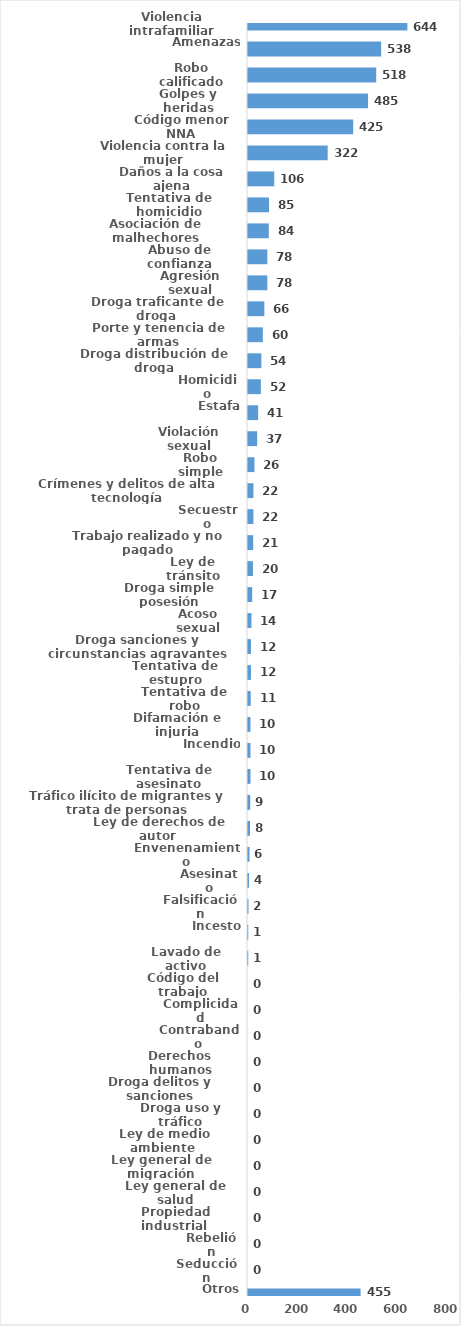
| Category | Series 0 |
|---|---|
| Violencia intrafamiliar | 644 |
| Amenazas | 538 |
| Robo calificado | 518 |
| Golpes y heridas | 485 |
| Código menor NNA | 425 |
| Violencia contra la mujer | 322 |
| Daños a la cosa ajena | 106 |
| Tentativa de homicidio | 85 |
| Asociación de malhechores | 84 |
| Abuso de confianza | 78 |
| Agresión sexual | 78 |
| Droga traficante de droga  | 66 |
| Porte y tenencia de armas | 60 |
| Droga distribución de droga | 54 |
| Homicidio | 52 |
| Estafa | 41 |
| Violación sexual | 37 |
| Robo simple | 26 |
| Crímenes y delitos de alta tecnología | 22 |
| Secuestro | 22 |
| Trabajo realizado y no pagado | 21 |
| Ley de tránsito | 20 |
| Droga simple posesión | 17 |
| Acoso sexual | 14 |
| Droga sanciones y circunstancias agravantes | 12 |
| Tentativa de estupro | 12 |
| Tentativa de robo | 11 |
| Difamación e injuria | 10 |
| Incendio | 10 |
| Tentativa de asesinato | 10 |
| Tráfico ilícito de migrantes y trata de personas | 9 |
| Ley de derechos de autor  | 8 |
| Envenenamiento | 6 |
| Asesinato | 4 |
| Falsificación | 2 |
| Incesto | 1 |
| Lavado de activo | 1 |
| Código del trabajo | 0 |
| Complicidad | 0 |
| Contrabando | 0 |
| Derechos humanos | 0 |
| Droga delitos y sanciones | 0 |
| Droga uso y tráfico | 0 |
| Ley de medio ambiente  | 0 |
| Ley general de migración | 0 |
| Ley general de salud | 0 |
| Propiedad industrial  | 0 |
| Rebelión | 0 |
| Seducción | 0 |
| Otros | 455 |